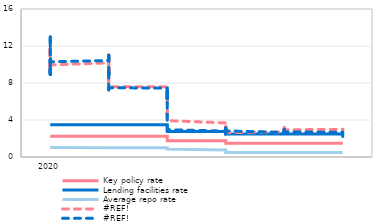
| Category | Key policy rate | Lending facilities rate | Average repo rate | #REF! |
|---|---|---|---|---|
| 2020-01-03 | 2.25 | 3.5 | 1.02 | 11.96 |
| 2020-01-06 | 2.25 | 3.5 | 1.02 | 12.63 |
| 2020-01-08 | 2.25 | 3.5 | 1.01 | 12.57 |
| 2020-01-09 | 2.25 | 3.5 | 1.01 | 12.99 |
| 2020-01-10 | 2.25 | 3.5 | 1.01 | 12.63 |
| 2020-01-13 | 2.25 | 3.5 | 1.01 | 12.34 |
| 2020-01-14 | 2.25 | 3.5 | 1.01 | 12 |
| 2020-01-15 | 2.25 | 3.5 | 1.01 | 11.82 |
| 2020-01-16 | 2.25 | 3.5 | 1.01 | 10.98 |
| 2020-01-17 | 2.25 | 3.5 | 1.01 | 10.97 |
| 2020-01-20 | 2.25 | 3.5 | 1.01 | 10.52 |
| 2020-01-21 | 2.25 | 3.5 | 1.01 | 9.76 |
| 2020-01-22 | 2.25 | 3.5 | 1.01 | 9.85 |
| 2020-01-23 | 2.25 | 3.5 | 1.01 | 9.41 |
| 2020-01-24 | 2.25 | 3.5 | 1.01 | 9.13 |
| 2020-01-27 | 2.25 | 3.5 | 1.01 | 9.43 |
| 2020-01-28 | 2.25 | 3.5 | 1.01 | 8.92 |
| 2020-01-29 | 2.25 | 3.5 | 1.01 | 10.12 |
| 2020-01-30 | 2.25 | 3.5 | 1.01 | 10.58 |
| 2020-01-31 | 2.25 | 3.5 | 1.01 | 10.29 |
| 2020-02-03 | 2.25 | 3.5 | 1.01 | 10.43 |
| 2020-02-04 | 2.25 | 3.5 | 1.01 | 10.53 |
| 2020-02-05 | 2.25 | 3.5 | 1.01 | 10.53 |
| 2020-02-06 | 2.25 | 3.5 | 1.01 | 10.6 |
| 2020-02-07 | 2.25 | 3.5 | 1.01 | 11 |
| 2020-02-10 | 2.25 | 3.5 | 1.01 | 10.6 |
| 2020-02-11 | 2.25 | 3.5 | 1.01 | 10.26 |
| 2020-02-12 | 2.25 | 3.5 | 1.01 | 9.3 |
| 2020-02-13 | 2.25 | 3.5 | 1.01 | 8.81 |
| 2020-02-14 | 2.25 | 3.5 | 1.01 | 9.18 |
| 2020-02-18 | 2.25 | 3.5 | 1.01 | 8.99 |
| 2020-02-19 | 2.25 | 3.5 | 1.01 | 8.97 |
| 2020-02-20 | 2.25 | 3.5 | 1.01 | 8.97 |
| 2020-02-21 | 2.25 | 3.5 | 1.01 | 8.75 |
| 2020-02-24 | 2.25 | 3.5 | 1.01 | 8.35 |
| 2020-02-25 | 2.25 | 3.5 | 1.01 | 7.88 |
| 2020-02-26 | 2.25 | 3.5 | 1.01 | 7.59 |
| 2020-02-27 | 2.25 | 3.5 | 1.01 | 7.26 |
| 2020-02-28 | 2.25 | 3.5 | 1.01 | 7.49 |
| 2020-03-02 | 2.25 | 3.5 | 1.01 | 7.45 |
| 2020-03-03 | 2.25 | 3.5 | 1.01 | 6.87 |
| 2020-03-04 | 2.25 | 3.5 | 1.01 | 6.68 |
| 2020-03-05 | 2.25 | 3.5 | 1.01 | 6.57 |
| 2020-03-06 | 2.25 | 3.5 | 1.01 | 6.34 |
| 2020-03-09 | 2.25 | 3.5 | 1.01 | 6.48 |
| 2020-03-10 | 2.25 | 3.5 | 1.01 | 6.43 |
| 2020-03-11 | 1.75 | 2.75 | 1 | 6.33 |
| 2020-03-12 | 1.75 | 2.75 | 1 | 6.83 |
| 2020-03-13 | 1.75 | 2.75 | 1 | 6.81 |
| 2020-03-16 | 1.75 | 2.75 | 1 | 7.22 |
| 2020-03-17 | 1.75 | 2.75 | 1 | 6.75 |
| 2020-03-18 | 1.75 | 2.75 | 0.85 | 5.78 |
| 2020-03-19 | 1.75 | 2.75 | 0.85 | 5.15 |
| 2020-03-20 | 1.75 | 2.75 | 0.85 | 4.89 |
| 2020-03-23 | 1.75 | 2.75 | 0.85 | 4.75 |
| 2020-03-24 | 1.75 | 2.75 | 0.85 | 4.5 |
| 2020-03-25 | 1.75 | 2.75 | 0.75 | 3.83 |
| 2020-03-26 | 1.75 | 2.75 | 0.75 | 3.3 |
| 2020-03-27 | 1.75 | 2.75 | 0.75 | 2.95 |
| 2020-03-30 | 1.75 | 2.75 | 0.75 | 2.98 |
| 2020-03-31 | 1.75 | 2.75 | 0.75 | 2.93 |
| 2020-04-01 | 1.75 | 2.75 | 0.75 | 2.8 |
| 2020-04-02 | 1.75 | 2.75 | 0.75 | 2.65 |
| 2020-04-03 | 1.75 | 2.75 | 0.75 | 2.55 |
| 2020-04-06 | 1.75 | 2.75 | 0.75 | 2.49 |
| 2020-04-07 | 1.75 | 2.75 | 0.75 | 2.39 |
| 2020-04-08 | 1.75 | 2.75 | 0.75 | 2.55 |
| 2020-04-09 | 1.5 | 2.5 | 0.75 | 2.54 |
| 2020-04-10 | 1.5 | 2.5 | 0.75 | 2.63 |
| 2020-04-13 | 1.5 | 2.5 | 0.75 | 2.62 |
| 2020-04-14 | 1.5 | 2.5 | 0.75 | 2.6 |
| 2020-04-15 | 1.5 | 2.5 | 0.5 | 2.94 |
| 2020-04-16 | 1.5 | 2.5 | 0.5 | 2.79 |
| 2020-04-21 | 1.5 | 2.5 | 0.5 | 2.85 |
| 2020-04-22 | 1.5 | 2.5 | 0.5 | 2.82 |
| 2020-04-23 | 1.5 | 2.5 | 0.5 | 2.77 |
| 2020-04-24 | 1.5 | 2.5 | 0.5 | 2.75 |
| 2020-04-27 | 1.5 | 2.5 | 0.5 | 2.69 |
| 2020-04-28 | 1.5 | 2.5 | 0.5 | 3.12 |
| 2020-04-29 | 1.5 | 2.5 | 0.5 | 2.98 |
| 2020-04-30 | 1.5 | 2.5 | 0.5 | 2.83 |
| 2020-05-04 | 1.5 | 2.5 | 0.5 | 2.65 |
| 2020-05-05 | 1.5 | 2.5 | 0.5 | 2.65 |
| 2020-05-06 | 1.5 | 2.5 | 0.5 | 2.84 |
| 2020-05-07 | 1.5 | 2.5 | 0.5 | 2.76 |
| 2020-05-08 | 1.5 | 2.5 | 0.5 | 2.86 |
| 2020-05-11 | 1.5 | 2.5 | 0.5 | 2.68 |
| 2020-05-12 | 1.5 | 2.5 | 0.5 | 2.73 |
| 2020-05-13 | 1.5 | 2.5 | 0.5 | 2.7 |
| 2020-05-14 | 1.5 | 2.5 | 0.5 | 2.58 |
| 2020-05-15 | 1.5 | 2.5 | 0.5 | 2.6 |
| 2020-05-18 | 1.5 | 2.5 | 0.5 | 2.61 |
| 2020-05-19 | 1.5 | 2.5 | 0.5 | 2.78 |
| 2020-05-20 | 1.5 | 2.5 | 0.5 | 2.78 |
| 2020-05-21 | 1.5 | 2.5 | 0.5 | 2.85 |
| 2020-05-22 | 1.5 | 2.5 | 0.5 | 2.75 |
| 2020-05-25 | 1.5 | 2.5 | 0.5 | 2.96 |
| 2020-05-26 | 1.5 | 2.5 | 0.5 | 2.71 |
| 2020-05-27 | 1.5 | 2.5 | 0.5 | 2.81 |
| 2020-05-28 | 1.5 | 2.5 | 0.5 | 2.74 |
| 2020-05-29 | 1.5 | 2.5 | 0.5 | 2.76 |
| 2020-06-01 | 1.5 | 2.5 | 0.5 | 2.67 |
| 2020-06-02 | 1.5 | 2.5 | 0.5 | 2.5 |
| 2020-06-03 | 1.5 | 2.5 | 0.5 | 2.21 |